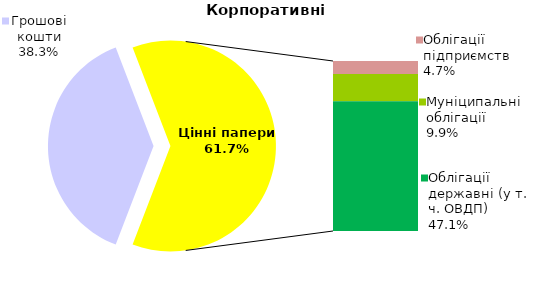
| Category | Корпоративні |
|---|---|
| Грошові кошти | 116.85 |
| Банківські метали | 0 |
| Нерухомість | 0 |
| Інші активи | 0 |
| Акції | 0.022 |
| Облігації підприємств | 14.298 |
| Муніципальні облігації | 30.173 |
| Облігації державні (у т. ч. ОВДП) | 143.515 |